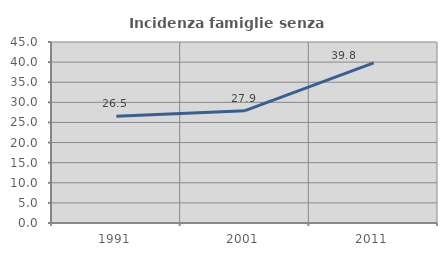
| Category | Incidenza famiglie senza nuclei |
|---|---|
| 1991.0 | 26.515 |
| 2001.0 | 27.93 |
| 2011.0 | 39.808 |